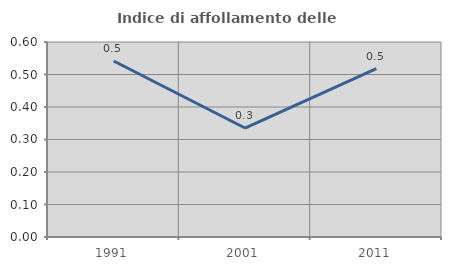
| Category | Indice di affollamento delle abitazioni  |
|---|---|
| 1991.0 | 0.542 |
| 2001.0 | 0.335 |
| 2011.0 | 0.518 |